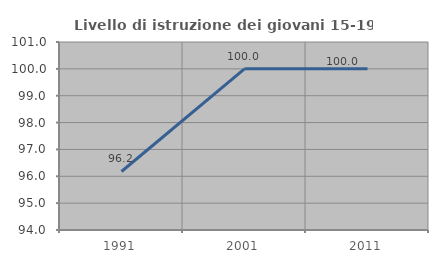
| Category | Livello di istruzione dei giovani 15-19 anni |
|---|---|
| 1991.0 | 96.178 |
| 2001.0 | 100 |
| 2011.0 | 100 |